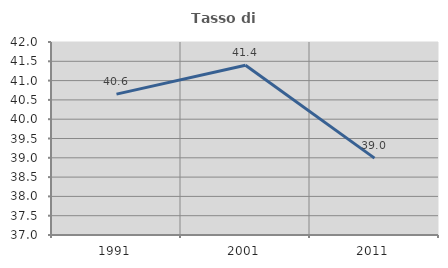
| Category | Tasso di occupazione   |
|---|---|
| 1991.0 | 40.649 |
| 2001.0 | 41.397 |
| 2011.0 | 38.992 |